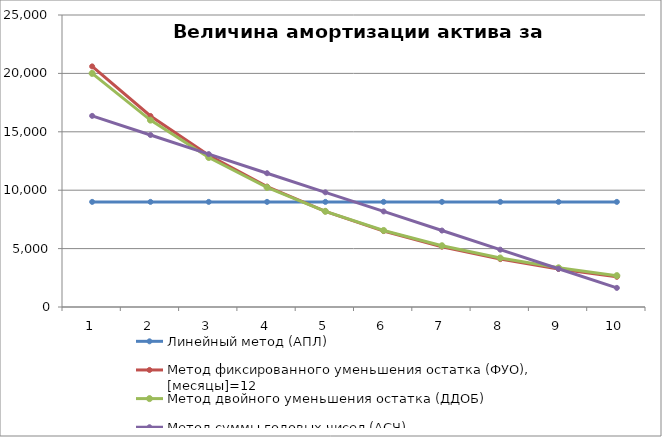
| Category | Линейный метод (АПЛ) | Метод фиксированного уменьшения остатка (ФУО), [месяцы]=12 | Метод двойного уменьшения остатка (ДДОБ) | Метод суммы годовых чисел (АСЧ) |
|---|---|---|---|---|
| 1.0 | 9000 | 20600 | 20000 | 16363.636 |
| 2.0 | 9000 | 16356.4 | 16000 | 14727.273 |
| 3.0 | 9000 | 12986.982 | 12800 | 13090.909 |
| 4.0 | 9000 | 10311.663 | 10240 | 11454.545 |
| 5.0 | 9000 | 8187.461 | 8192 | 9818.182 |
| 6.0 | 9000 | 6500.844 | 6553.6 | 8181.818 |
| 7.0 | 9000 | 5161.67 | 5242.88 | 6545.455 |
| 8.0 | 9000 | 4098.366 | 4194.304 | 4909.091 |
| 9.0 | 9000 | 3254.103 | 3355.443 | 3272.727 |
| 10.0 | 9000 | 2583.757 | 2684.355 | 1636.364 |